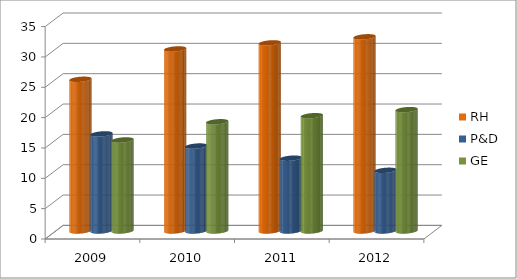
| Category | RH | P&D | GE |
|---|---|---|---|
| 2009.0 | 25 | 16 | 15 |
| 2010.0 | 30 | 14 | 18 |
| 2011.0 | 31 | 12 | 19 |
| 2012.0 | 32 | 10 | 20 |